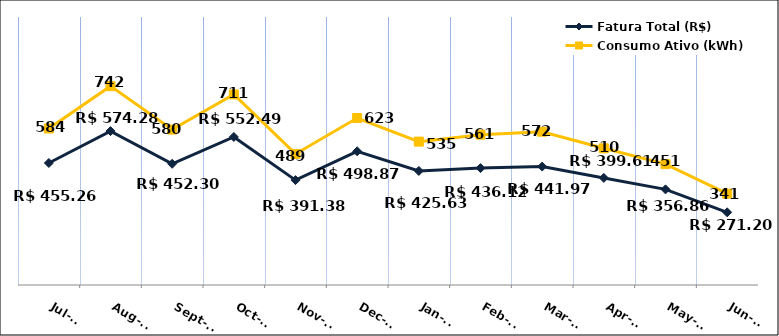
| Category | Fatura Total (R$) |
|---|---|
| 2023-07-01 | 455.26 |
| 2023-08-01 | 574.28 |
| 2023-09-01 | 452.3 |
| 2023-10-01 | 552.49 |
| 2023-11-01 | 391.38 |
| 2023-12-01 | 498.87 |
| 2024-01-01 | 425.63 |
| 2024-02-01 | 436.12 |
| 2024-03-01 | 441.97 |
| 2024-04-01 | 399.61 |
| 2024-05-01 | 356.86 |
| 2024-06-01 | 271.2 |